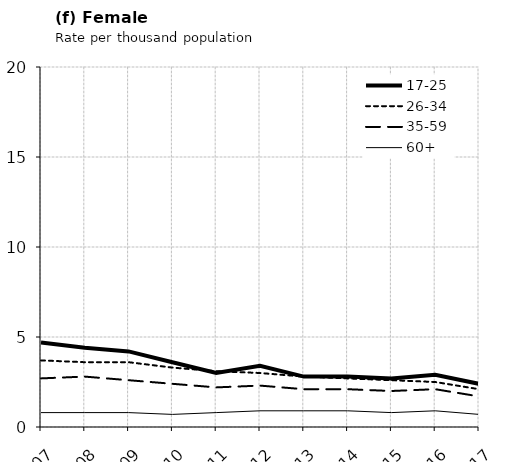
| Category | 17-25 | 26-34 | 35-59 | 60+ |
|---|---|---|---|---|
| 2007.0 | 4.7 | 3.7 | 2.7 | 0.8 |
| 2008.0 | 4.4 | 3.6 | 2.8 | 0.8 |
| 2009.0 | 4.2 | 3.6 | 2.6 | 0.8 |
| 2010.0 | 3.6 | 3.3 | 2.4 | 0.7 |
| 2011.0 | 3 | 3.1 | 2.2 | 0.8 |
| 2012.0 | 3.4 | 3 | 2.3 | 0.9 |
| 2013.0 | 2.8 | 2.8 | 2.1 | 0.9 |
| 2014.0 | 2.8 | 2.7 | 2.1 | 0.9 |
| 2015.0 | 2.7 | 2.6 | 2 | 0.8 |
| 2016.0 | 2.9 | 2.5 | 2.1 | 0.9 |
| 2017.0 | 2.4 | 2.1 | 1.7 | 0.7 |